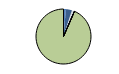
| Category | Series 0 |
|---|---|
| ARRASTRE | 12 |
| CERCO | 29 |
| ATUNEROS CAÑEROS | 2 |
| PALANGRE DE FONDO | 9 |
| PALANGRE DE SUPERFICIE | 3 |
| RASCO | 0 |
| VOLANTA | 0 |
| ARTES FIJAS | 0 |
| ARTES MENORES | 789 |